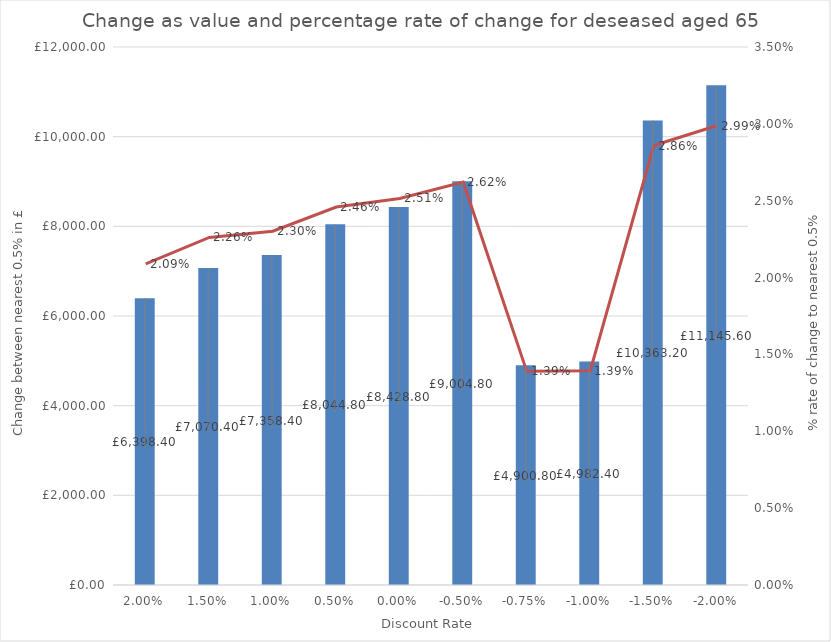
| Category | Value change |
|---|---|
| 0.02 | 6398.4 |
| 0.015 | 7070.4 |
| 0.01 | 7358.4 |
| 0.005 | 8044.8 |
| 0.0 | 8428.8 |
| -0.005 | 9004.8 |
| -0.0075 | 4900.8 |
| -0.01 | 4982.4 |
| -0.015 | 10363.2 |
| -0.02 | 11145.6 |